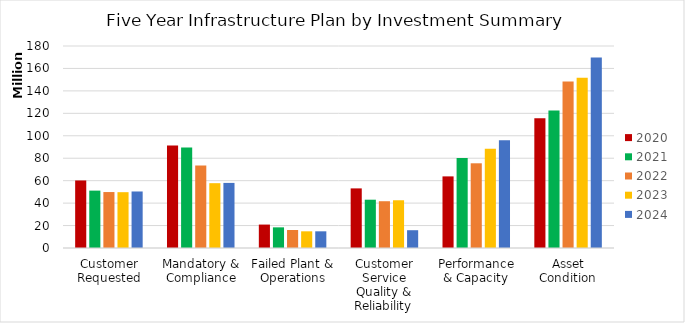
| Category | 2020 | 2021 | 2022 | 2023 | 2024 |
|---|---|---|---|---|---|
| Customer Requested | 60181711 | 51134379 | 49859819 | 49734401 | 50362596 |
| Mandatory & Compliance | 91410119 | 89600960 | 73515726 | 57761343 | 58005327 |
| Failed Plant & Operations | 20877880 | 18398000 | 16028200 | 14868000 | 14868000 |
| Customer Service Quality & Reliability | 53112537 | 43039745 | 41682500 | 42540000 | 15850000 |
| Performance & Capacity | 63815596 | 80225608 | 75481254 | 88396578 | 96050245 |
| Asset Condition | 115602157 | 122601308 | 148432501 | 151699678 | 169863832 |